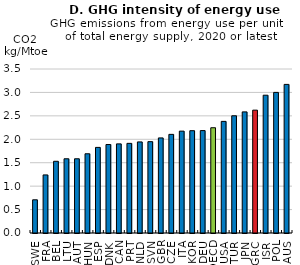
| Category | GHG from energy / TPES |
|---|---|
| SWE | 0.708 |
| FRA | 1.239 |
| BEL | 1.53 |
| LTU | 1.584 |
| AUT | 1.584 |
| HUN | 1.691 |
| ESP | 1.827 |
| DNK | 1.888 |
| CAN | 1.902 |
| PRT | 1.913 |
| NLD | 1.944 |
| SVN | 1.949 |
| GBR | 2.029 |
| CZE | 2.105 |
| ITA | 2.174 |
| KOR | 2.183 |
| DEU | 2.186 |
| OECD | 2.246 |
| USA | 2.382 |
| TUR | 2.502 |
| JPN | 2.584 |
| GRC | 2.622 |
| ISR | 2.941 |
| POL | 3.001 |
| AUS | 3.171 |